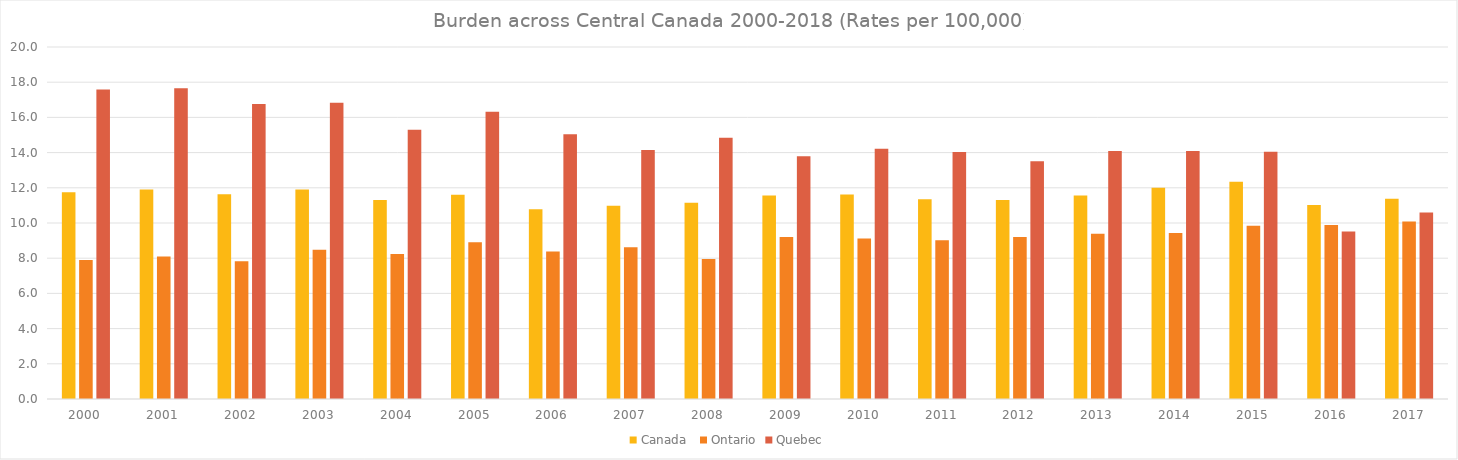
| Category | Canada  | Ontario | Quebec |
|---|---|---|---|
| 2000.0 | 11.751 | 7.9 | 17.589 |
| 2001.0 | 11.902 | 8.103 | 17.657 |
| 2002.0 | 11.639 | 7.83 | 16.757 |
| 2003.0 | 11.898 | 8.477 | 16.832 |
| 2004.0 | 11.312 | 8.24 | 15.301 |
| 2005.0 | 11.608 | 8.9 | 16.316 |
| 2006.0 | 10.783 | 8.387 | 15.042 |
| 2007.0 | 10.979 | 8.617 | 14.143 |
| 2008.0 | 11.144 | 7.956 | 14.842 |
| 2009.0 | 11.567 | 9.209 | 13.795 |
| 2010.0 | 11.619 | 9.113 | 14.213 |
| 2011.0 | 11.346 | 9.019 | 14.041 |
| 2012.0 | 11.309 | 9.2 | 13.509 |
| 2013.0 | 11.555 | 9.385 | 14.092 |
| 2014.0 | 12.004 | 9.429 | 14.098 |
| 2015.0 | 12.338 | 9.842 | 14.055 |
| 2016.0 | 11.016 | 9.888 | 9.519 |
| 2017.0 | 11.376 | 10.091 | 10.593 |